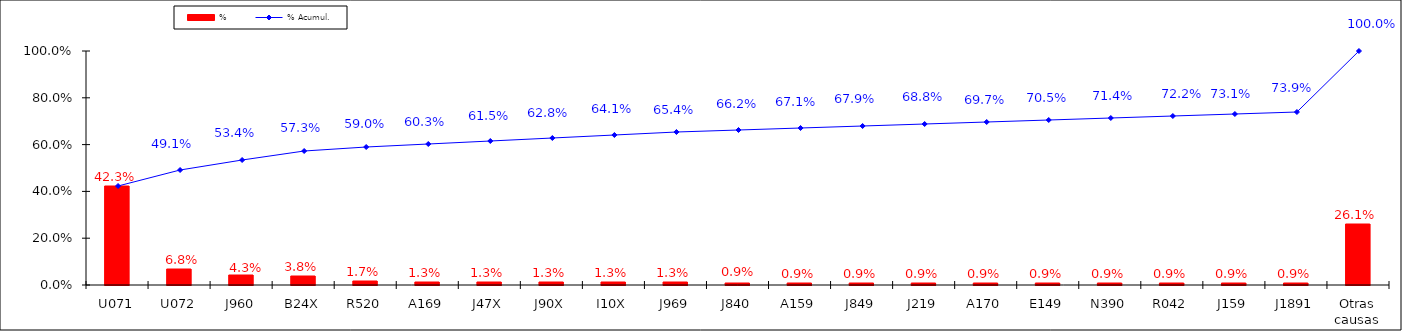
| Category | % |
|---|---|
| U071 | 0.423 |
| U072 | 0.068 |
| J960 | 0.043 |
| B24X | 0.038 |
| R520 | 0.017 |
| A169 | 0.013 |
| J47X | 0.013 |
| J90X | 0.013 |
| I10X | 0.013 |
| J969 | 0.013 |
| J840 | 0.009 |
| A159 | 0.009 |
| J849 | 0.009 |
| J219 | 0.009 |
| A170 | 0.009 |
| E149 | 0.009 |
| N390 | 0.009 |
| R042 | 0.009 |
| J159 | 0.009 |
| J1891 | 0.009 |
| Otras causas | 0.261 |